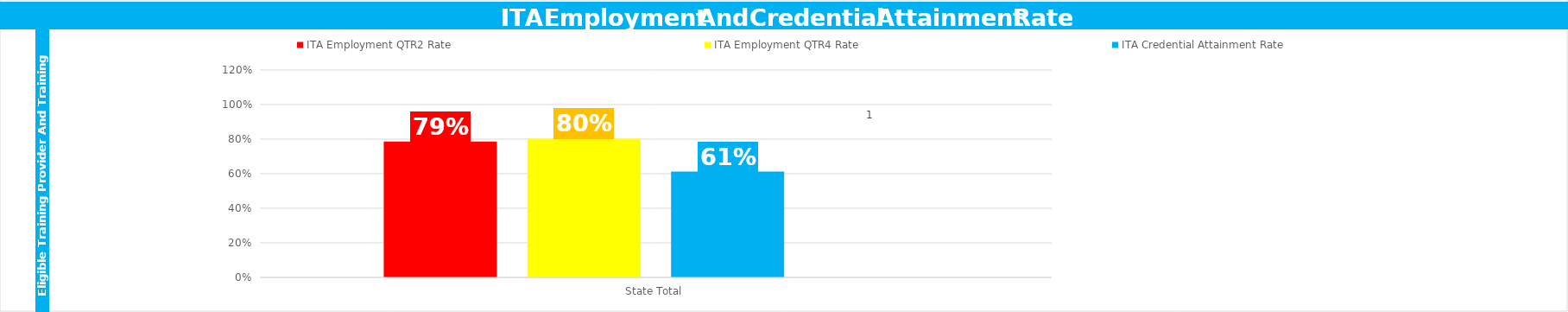
| Category | ITA Employment QTR2 Rate  | ITA Employment QTR4 Rate  | ITA Credential Attainment Rate  | State Total  |
|---|---|---|---|---|
| State Total | 0.787 | 0.803 | 0.612 | 1 |